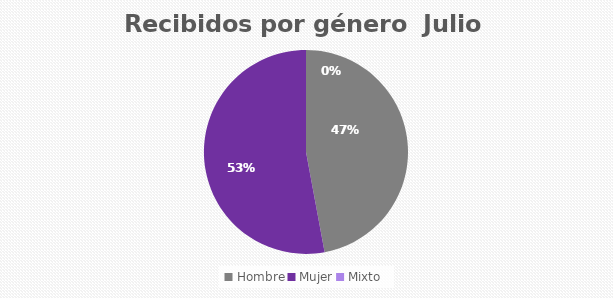
| Category | Recibidos por género  JULIO |
|---|---|
| Hombre | 338 |
| Mujer | 380 |
| Mixto | 0 |